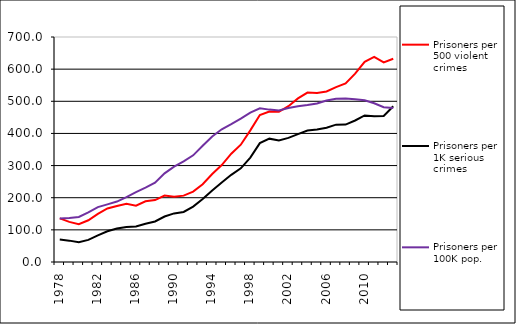
| Category | Prisoners per 500 violent crimes | Prisoners per 1K serious crimes | Prisoners per 100K pop. |
|---|---|---|---|
| 1978.0 | 135.596 | 69.864 | 135.007 |
| 1979.0 | 124.778 | 66.466 | 136.97 |
| 1980.0 | 117.501 | 61.475 | 140.211 |
| 1981.0 | 129.852 | 68.788 | 154.129 |
| 1982.0 | 149.546 | 82.926 | 170.728 |
| 1983.0 | 166.66 | 95.568 | 179.367 |
| 1984.0 | 174.116 | 104.14 | 188.02 |
| 1985.0 | 180.968 | 109.192 | 201.984 |
| 1986.0 | 175.294 | 110.364 | 217.415 |
| 1987.0 | 188.953 | 118.811 | 231.464 |
| 1988.0 | 192.735 | 126.19 | 246.926 |
| 1989.0 | 206.832 | 141.437 | 275.873 |
| 1990.0 | 203.277 | 151.2 | 296.627 |
| 1991.0 | 206.514 | 155.775 | 313.148 |
| 1992.0 | 218.985 | 172.282 | 331.835 |
| 1993.0 | 241.969 | 195.78 | 361.574 |
| 1994.0 | 273.647 | 222.449 | 390.544 |
| 1995.0 | 301.597 | 247.013 | 412.865 |
| 1996.0 | 336.895 | 271.213 | 428.959 |
| 1997.0 | 364.995 | 291.541 | 446.007 |
| 1998.0 | 409.572 | 324.954 | 464.934 |
| 1999.0 | 457.237 | 369.765 | 478.227 |
| 2000.0 | 467.972 | 383.772 | 474.083 |
| 2001.0 | 467.258 | 378.294 | 471.481 |
| 2002.0 | 484.842 | 386.166 | 479.389 |
| 2003.0 | 508.92 | 398.01 | 484.324 |
| 2004.0 | 527.072 | 409.107 | 488.232 |
| 2005.0 | 525.929 | 412.517 | 493.366 |
| 2006.0 | 530.519 | 417.736 | 502.54 |
| 2007.0 | 544.206 | 427.278 | 508.204 |
| 2008.0 | 555.691 | 427.423 | 508.499 |
| 2009.0 | 585.858 | 440.205 | 506.039 |
| 2010.0 | 622.937 | 455.846 | 502.896 |
| 2011.0 | 637.98 | 453.78 | 493.873 |
| 2012.0 | 620.959 | 454.312 | 481.562 |
| 2013.0 | 632.488 | 484.612 | 479.489 |